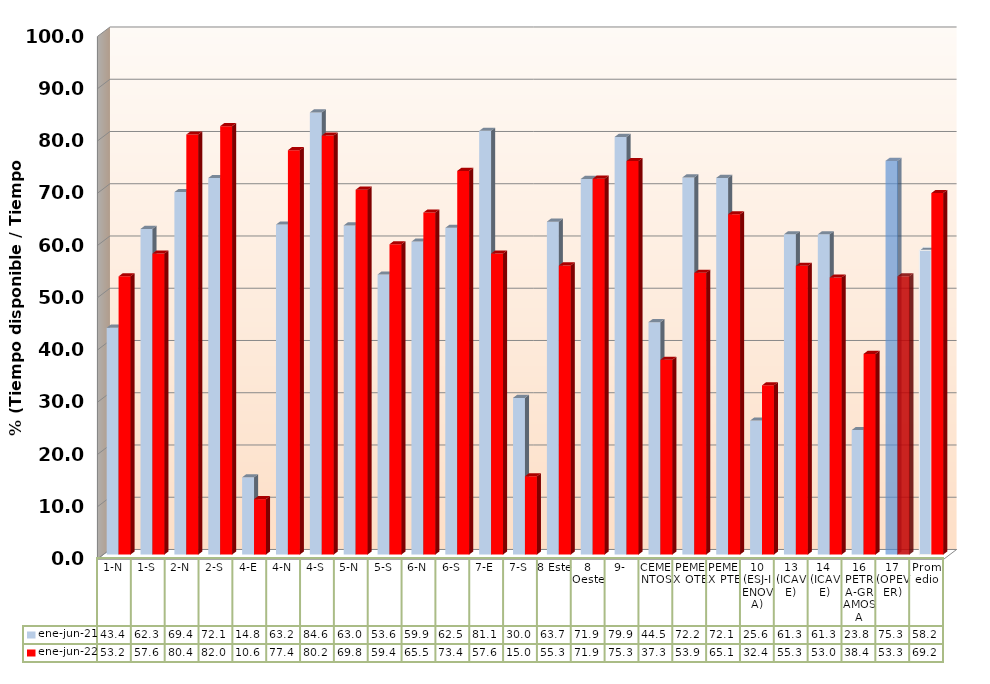
| Category | ene-jun-21 | ene-jun-22 |
|---|---|---|
| 1-N | 43.414 | 53.242 |
| 1-S | 62.317 | 57.603 |
| 2-N | 69.37 | 80.383 |
| 2-S | 72.066 | 81.991 |
| 4-E | 14.785 | 10.598 |
| 4-N | 63.152 | 77.391 |
| 4-S | 84.611 | 80.191 |
| 5-N | 62.99 | 69.826 |
| 5-S | 53.6 | 59.381 |
| 6-N | 59.893 | 65.455 |
| 6-S | 62.526 | 73.421 |
| 7-E | 81.086 | 57.606 |
| 7-S | 29.982 | 14.97 |
| 8 Este | 63.713 | 55.329 |
| 8 Oeste | 71.888 | 71.939 |
| 9- | 79.929 | 75.311 |
| CEMENTOS | 44.479 | 37.283 |
| PEMEX OTE | 72.171 | 53.908 |
| PEMEX PTE | 72.08 | 65.134 |
| 10 (ESJ-IENOVA) | 25.636 | 32.381 |
| 13 (ICAVE) | 61.284 | 55.255 |
| 14  (ICAVE) | 61.284 | 53.03 |
| 16 PETRA-GRAMOSA | 23.82 | 38.402 |
| 17 (OPEVER) | 75.344 | 53.252 |
| Promedio | 58.238 | 69.177 |